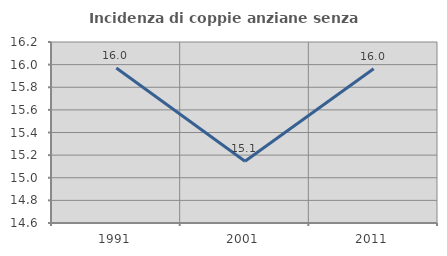
| Category | Incidenza di coppie anziane senza figli  |
|---|---|
| 1991.0 | 15.97 |
| 2001.0 | 15.146 |
| 2011.0 | 15.963 |